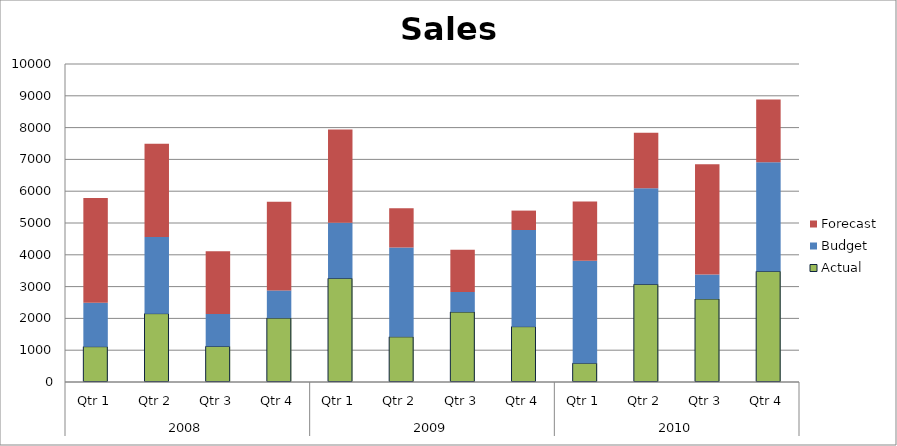
| Category | Actual | Budget | Forecast |
|---|---|---|---|
| 0 | 1110 | 1380 | 3300 |
| 1 | 2150 | 2410 | 2930 |
| 2 | 1120 | 1020 | 1970 |
| 3 | 2010 | 870 | 2790 |
| 4 | 3260 | 1750 | 2930 |
| 5 | 1420 | 2810 | 1230 |
| 6 | 2200 | 630 | 1330 |
| 7 | 1740 | 3040 | 610 |
| 8 | 590 | 3220 | 1870 |
| 9 | 3070 | 3020 | 1750 |
| 10 | 2610 | 770 | 3470 |
| 11 | 3480 | 3430 | 1970 |